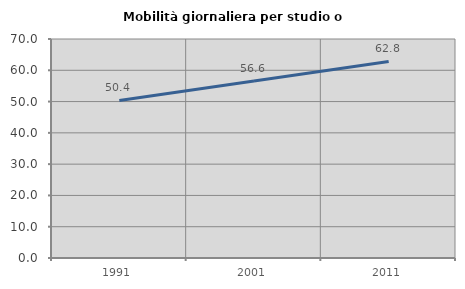
| Category | Mobilità giornaliera per studio o lavoro |
|---|---|
| 1991.0 | 50.361 |
| 2001.0 | 56.561 |
| 2011.0 | 62.839 |